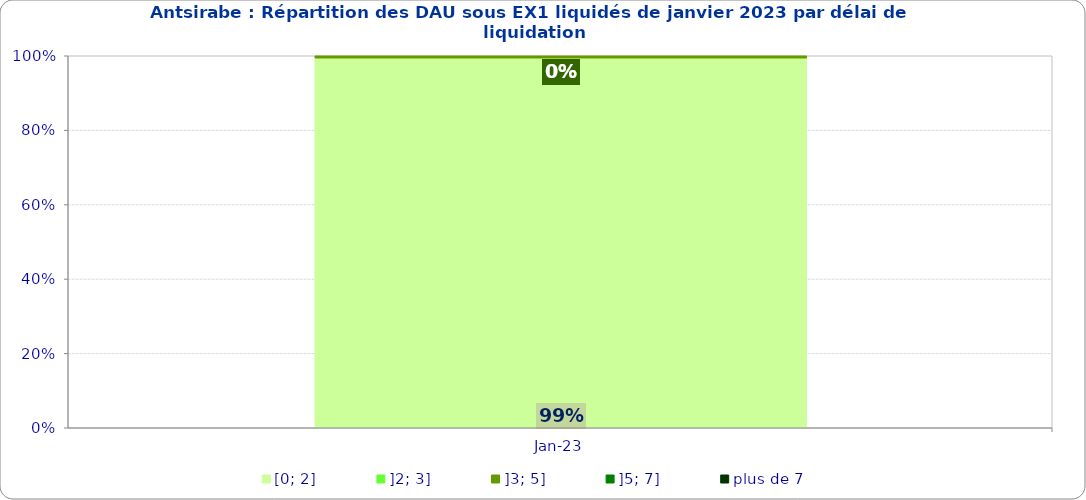
| Category | [0; 2] | ]2; 3] | ]3; 5] | ]5; 7] | plus de 7 |
|---|---|---|---|---|---|
| 2023-01-01 | 0.994 | 0 | 0.006 | 0 | 0 |